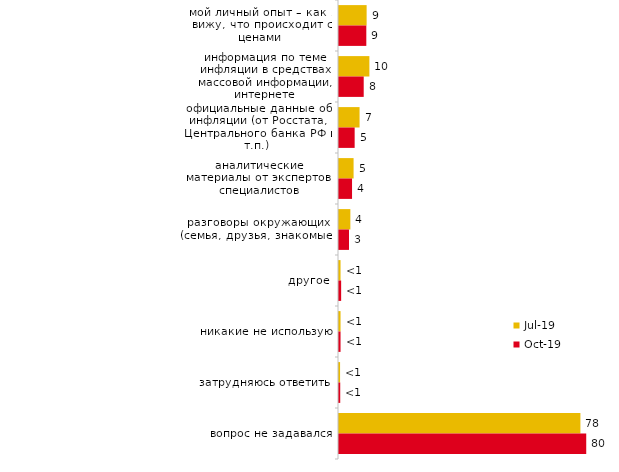
| Category | июл.19 | окт.19 |
|---|---|---|
| мой личный опыт – как я вижу, что происходит с ценами | 8.911 | 8.812 |
| информация по теме инфляции в средствах массовой информации, интернете | 9.802 | 7.97 |
| официальные данные об инфляции (от Росстата, Центрального банка РФ и т.п.) | 6.634 | 5.05 |
| аналитические материалы от экспертов, специалистов | 4.703 | 4.208 |
| разговоры окружающих (семья, друзья, знакомые) | 3.663 | 3.218 |
| другое | 0.495 | 0.693 |
| никакие не использую | 0.495 | 0.495 |
| затрудняюсь ответить | 0.347 | 0.396 |
| вопрос не задавался | 77.871 | 79.752 |